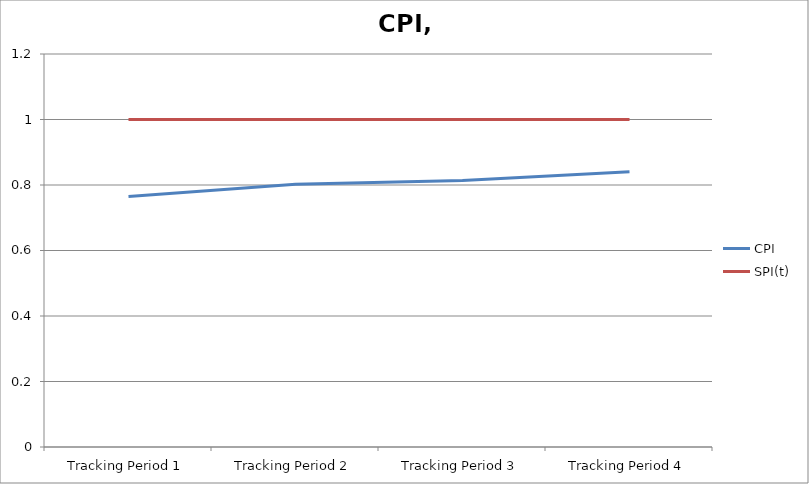
| Category | CPI | SPI(t) |
|---|---|---|
| Tracking Period 1 | 0.765 | 1 |
| Tracking Period 2 | 0.802 | 1 |
| Tracking Period 3 | 0.814 | 1 |
| Tracking Period 4 | 0.84 | 1 |